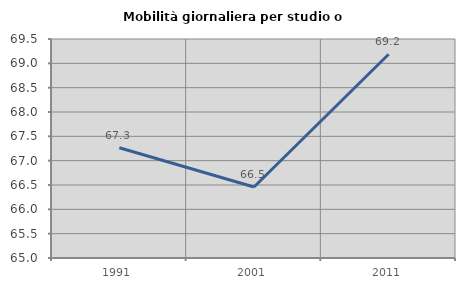
| Category | Mobilità giornaliera per studio o lavoro |
|---|---|
| 1991.0 | 67.266 |
| 2001.0 | 66.459 |
| 2011.0 | 69.187 |